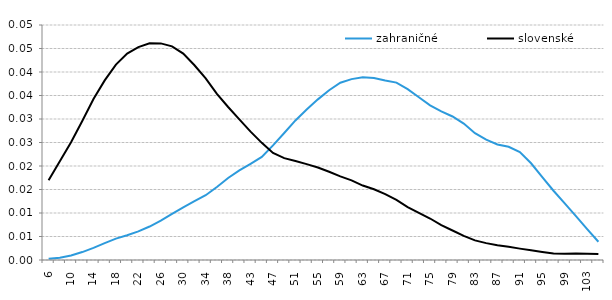
| Category | zahraničné | slovenské |
|---|---|---|
| 6.465809 | 0 | 0.017 |
| 8.4678435 | 0 | 0.021 |
| 10.469878 | 0.001 | 0.025 |
| 12.471912 | 0.002 | 0.03 |
| 14.473947 | 0.003 | 0.034 |
| 16.475981 | 0.004 | 0.038 |
| 18.478016 | 0.005 | 0.042 |
| 20.48005 | 0.005 | 0.044 |
| 22.482085 | 0.006 | 0.045 |
| 24.484119 | 0.007 | 0.046 |
| 26.486154 | 0.008 | 0.046 |
| 28.488188 | 0.01 | 0.045 |
| 30.490223 | 0.011 | 0.044 |
| 32.492257 | 0.013 | 0.041 |
| 34.494292 | 0.014 | 0.039 |
| 36.496326 | 0.016 | 0.035 |
| 38.498361 | 0.017 | 0.033 |
| 40.500395 | 0.019 | 0.03 |
| 42.50243 | 0.02 | 0.027 |
| 44.504464 | 0.022 | 0.025 |
| 46.506498 | 0.024 | 0.023 |
| 48.508533 | 0.027 | 0.022 |
| 50.510567 | 0.03 | 0.021 |
| 52.512602 | 0.032 | 0.02 |
| 54.514636 | 0.034 | 0.02 |
| 56.516671 | 0.036 | 0.019 |
| 58.518705 | 0.038 | 0.018 |
| 60.52074 | 0.038 | 0.017 |
| 62.522774 | 0.039 | 0.016 |
| 64.524809 | 0.039 | 0.015 |
| 66.526843 | 0.038 | 0.014 |
| 68.528878 | 0.038 | 0.013 |
| 70.530912 | 0.036 | 0.011 |
| 72.532947 | 0.035 | 0.01 |
| 74.534981 | 0.033 | 0.009 |
| 76.537016 | 0.032 | 0.007 |
| 78.53905 | 0.031 | 0.006 |
| 80.541085 | 0.029 | 0.005 |
| 82.543119 | 0.027 | 0.004 |
| 84.545153 | 0.026 | 0.004 |
| 86.547188 | 0.025 | 0.003 |
| 88.549222 | 0.024 | 0.003 |
| 90.551257 | 0.023 | 0.002 |
| 92.553291 | 0.021 | 0.002 |
| 94.555326 | 0.018 | 0.002 |
| 96.55736 | 0.015 | 0.001 |
| 98.559395 | 0.012 | 0.001 |
| 100.56143 | 0.009 | 0.001 |
| 102.56346 | 0.007 | 0.001 |
| 104.5655 | 0.004 | 0.001 |